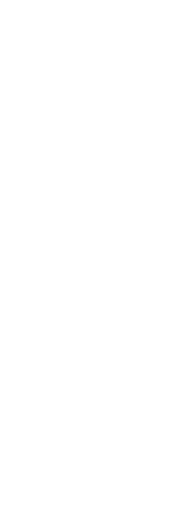
| Category | Series 10 | G | F | E | D | C | B | A | A+ | A++ |
|---|---|---|---|---|---|---|---|---|---|---|
| 0 | 8 |  |  |  |  |  |  |  |  |  |